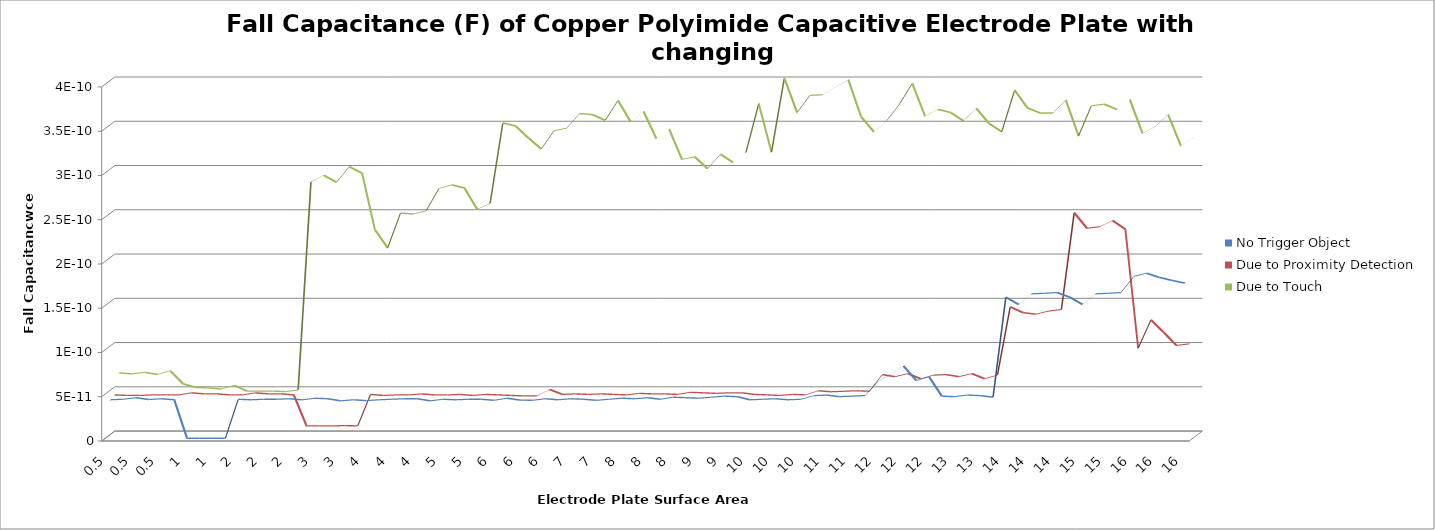
| Category | No Trigger Object  | Due to Proximity Detection | Due to Touch  |
|---|---|---|---|
| 0.5 | 0 | 0 | 0 |
| 0.5 | 0 | 0 | 0 |
| 0.5 | 0 | 0 | 0 |
| 0.5 | 0 | 0 | 0 |
| 0.5 | 0 | 0 | 0 |
| 1.0 | 0 | 0 | 0 |
| 1.0 | 0 | 0 | 0 |
| 1.0 | 0 | 0 | 0 |
| 1.0 | 0 | 0 | 0 |
| 1.0 | 0 | 0 | 0 |
| 2.0 | 0 | 0 | 0 |
| 2.0 | 0 | 0 | 0 |
| 2.0 | 0 | 0 | 0 |
| 2.0 | 0 | 0 | 0 |
| 2.0 | 0 | 0 | 0 |
| 3.0 | 0 | 0 | 0 |
| 3.0 | 0 | 0 | 0 |
| 3.0 | 0 | 0 | 0 |
| 3.0 | 0 | 0 | 0 |
| 3.0 | 0 | 0 | 0 |
| 4.0 | 0 | 0 | 0 |
| 4.0 | 0 | 0 | 0 |
| 4.0 | 0 | 0 | 0 |
| 4.0 | 0 | 0 | 0 |
| 4.0 | 0 | 0 | 0 |
| 5.0 | 0 | 0 | 0 |
| 5.0 | 0 | 0 | 0 |
| 5.0 | 0 | 0 | 0 |
| 5.0 | 0 | 0 | 0 |
| 5.0 | 0 | 0 | 0 |
| 6.0 | 0 | 0 | 0 |
| 6.0 | 0 | 0 | 0 |
| 6.0 | 0 | 0 | 0 |
| 6.0 | 0 | 0 | 0 |
| 6.0 | 0 | 0 | 0 |
| 7.0 | 0 | 0 | 0 |
| 7.0 | 0 | 0 | 0 |
| 7.0 | 0 | 0 | 0 |
| 7.0 | 0 | 0 | 0 |
| 7.0 | 0 | 0 | 0 |
| 8.0 | 0 | 0 | 0 |
| 8.0 | 0 | 0 | 0 |
| 8.0 | 0 | 0 | 0 |
| 8.0 | 0 | 0 | 0 |
| 8.0 | 0 | 0 | 0 |
| 9.0 | 0 | 0 | 0 |
| 9.0 | 0 | 0 | 0 |
| 9.0 | 0 | 0 | 0 |
| 9.0 | 0 | 0 | 0 |
| 9.0 | 0 | 0 | 0 |
| 10.0 | 0 | 0 | 0 |
| 10.0 | 0 | 0 | 0 |
| 10.0 | 0 | 0 | 0 |
| 10.0 | 0 | 0 | 0 |
| 10.0 | 0 | 0 | 0 |
| 11.0 | 0 | 0 | 0 |
| 11.0 | 0 | 0 | 0 |
| 11.0 | 0 | 0 | 0 |
| 11.0 | 0 | 0 | 0 |
| 11.0 | 0 | 0 | 0 |
| 12.0 | 0 | 0 | 0 |
| 12.0 | 0 | 0 | 0 |
| 12.0 | 0 | 0 | 0 |
| 12.0 | 0 | 0 | 0 |
| 12.0 | 0 | 0 | 0 |
| 13.0 | 0 | 0 | 0 |
| 13.0 | 0 | 0 | 0 |
| 13.0 | 0 | 0 | 0 |
| 13.0 | 0 | 0 | 0 |
| 13.0 | 0 | 0 | 0 |
| 14.0 | 0 | 0 | 0 |
| 14.0 | 0 | 0 | 0 |
| 14.0 | 0 | 0 | 0 |
| 14.0 | 0 | 0 | 0 |
| 14.0 | 0 | 0 | 0 |
| 15.0 | 0 | 0 | 0 |
| 15.0 | 0 | 0 | 0 |
| 15.0 | 0 | 0 | 0 |
| 15.0 | 0 | 0 | 0 |
| 15.0 | 0 | 0 | 0 |
| 16.0 | 0 | 0 | 0 |
| 16.0 | 0 | 0 | 0 |
| 16.0 | 0 | 0 | 0 |
| 16.0 | 0 | 0 | 0 |
| 16.0 | 0 | 0 | 0 |